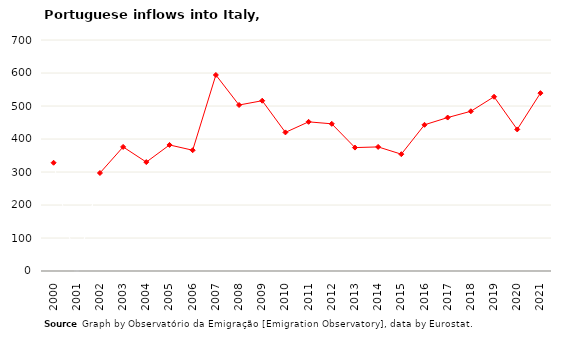
| Category | Series 1 |
|---|---|
| 2000.0 | 328 |
| 2001.0 | 0 |
| 2002.0 | 297 |
| 2003.0 | 376 |
| 2004.0 | 330 |
| 2005.0 | 382 |
| 2006.0 | 366 |
| 2007.0 | 594 |
| 2008.0 | 503 |
| 2009.0 | 516 |
| 2010.0 | 420 |
| 2011.0 | 452 |
| 2012.0 | 446 |
| 2013.0 | 374 |
| 2014.0 | 376 |
| 2015.0 | 354 |
| 2016.0 | 443 |
| 2017.0 | 465 |
| 2018.0 | 484 |
| 2019.0 | 528 |
| 2020.0 | 429 |
| 2021.0 | 539 |